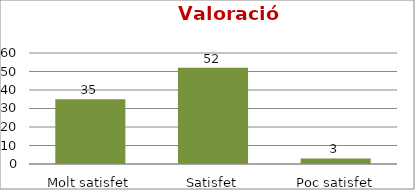
| Category | Series 0 |
|---|---|
| Molt satisfet | 35 |
| Satisfet | 52 |
| Poc satisfet | 3 |